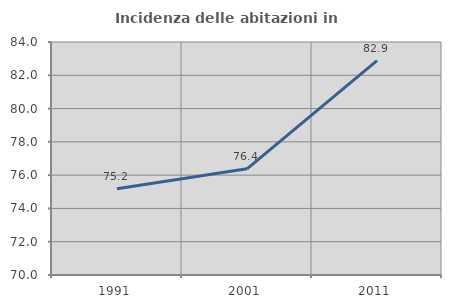
| Category | Incidenza delle abitazioni in proprietà  |
|---|---|
| 1991.0 | 75.178 |
| 2001.0 | 76.378 |
| 2011.0 | 82.878 |